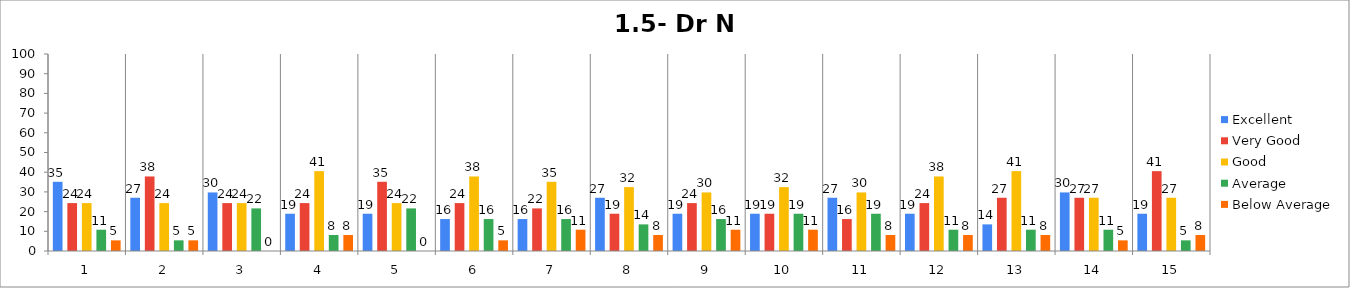
| Category | Excellent | Very Good | Good | Average | Below Average |
|---|---|---|---|---|---|
| 0 | 35.135 | 24.324 | 24.324 | 10.811 | 5.405 |
| 1 | 27.027 | 37.838 | 24.324 | 5.405 | 5.405 |
| 2 | 29.73 | 24.324 | 24.324 | 21.622 | 0 |
| 3 | 18.919 | 24.324 | 40.541 | 8.108 | 8.108 |
| 4 | 18.919 | 35.135 | 24.324 | 21.622 | 0 |
| 5 | 16.216 | 24.324 | 37.838 | 16.216 | 5.405 |
| 6 | 16.216 | 21.622 | 35.135 | 16.216 | 10.811 |
| 7 | 27.027 | 18.919 | 32.432 | 13.514 | 8.108 |
| 8 | 18.919 | 24.324 | 29.73 | 16.216 | 10.811 |
| 9 | 18.919 | 18.919 | 32.432 | 18.919 | 10.811 |
| 10 | 27.027 | 16.216 | 29.73 | 18.919 | 8.108 |
| 11 | 18.919 | 24.324 | 37.838 | 10.811 | 8.108 |
| 12 | 13.514 | 27.027 | 40.541 | 10.811 | 8.108 |
| 13 | 29.73 | 27.027 | 27.027 | 10.811 | 5.405 |
| 14 | 18.919 | 40.541 | 27.027 | 5.405 | 8.108 |